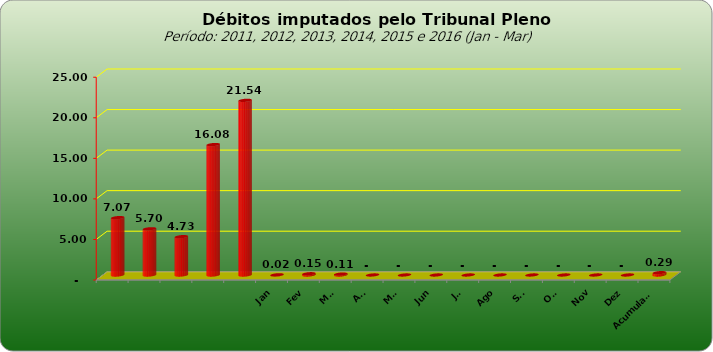
| Category |  7.073.154,74   5.698.720,25   4.727.033,51   16.081.820,48   21.535.723,60   22.059,63   154.318,14   112.460,95   -     -     -     -     -     -     -     -     -     288.838,72  |
|---|---|
|  | 7073154.74 |
|  | 5698720.25 |
|  | 4727033.51 |
|  | 16081820.48 |
|  | 21535723.6 |
| Jan | 22059.63 |
| Fev | 154318.14 |
| Mar | 112460.95 |
| Abr | 0 |
| Mai | 0 |
| Jun | 0 |
| Jul | 0 |
| Ago | 0 |
| Set | 0 |
| Out | 0 |
| Nov | 0 |
| Dez | 0 |
| Acumulado | 288838.72 |